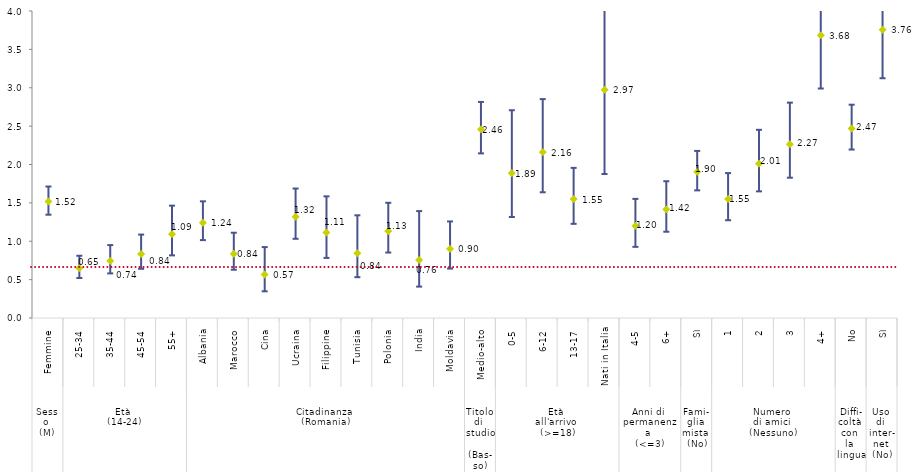
| Category | Series 0 |
|---|---|
| 0 | 1.518 |
| 1 | 0.65 |
| 2 | 0.743 |
| 3 | 0.835 |
| 4 | 1.093 |
| 5 | 1.242 |
| 6 | 0.836 |
| 7 | 0.567 |
| 8 | 1.319 |
| 9 | 1.114 |
| 10 | 0.844 |
| 11 | 1.131 |
| 12 | 0.755 |
| 13 | 0.9 |
| 14 | 2.458 |
| 15 | 1.888 |
| 16 | 2.162 |
| 17 | 1.549 |
| 18 | 2.974 |
| 19 | 1.2 |
| 20 | 1.415 |
| 21 | 1.903 |
| 22 | 1.551 |
| 23 | 2.011 |
| 24 | 2.265 |
| 25 | 3.684 |
| 26 | 2.47 |
| 27 | 3.756 |